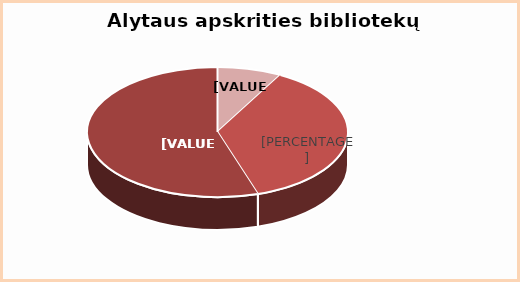
| Category | Series 0 |
|---|---|
| Kompleksiniai | 0.08 |
| Žodiniai | 0.37 |
| Vaizdiniai | 0.55 |